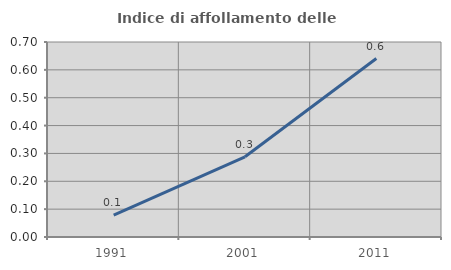
| Category | Indice di affollamento delle abitazioni  |
|---|---|
| 1991.0 | 0.079 |
| 2001.0 | 0.288 |
| 2011.0 | 0.641 |